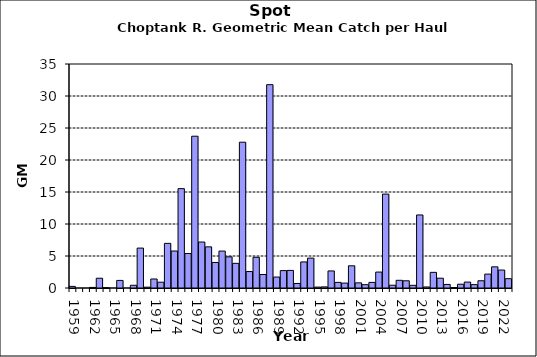
| Category | Series 0 |
|---|---|
| 1959.0 | 0.251 |
| 1960.0 | 0 |
| 1961.0 | 0 |
| 1962.0 | 0.091 |
| 1963.0 | 1.527 |
| 1964.0 | 0.044 |
| 1965.0 | 0 |
| 1966.0 | 1.185 |
| 1967.0 | 0 |
| 1968.0 | 0.426 |
| 1969.0 | 6.237 |
| 1970.0 | 0.128 |
| 1971.0 | 1.407 |
| 1972.0 | 0.905 |
| 1973.0 | 6.974 |
| 1974.0 | 5.78 |
| 1975.0 | 15.524 |
| 1976.0 | 5.389 |
| 1977.0 | 23.717 |
| 1978.0 | 7.182 |
| 1979.0 | 6.429 |
| 1980.0 | 3.987 |
| 1981.0 | 5.77 |
| 1982.0 | 4.871 |
| 1983.0 | 3.851 |
| 1984.0 | 22.779 |
| 1985.0 | 2.572 |
| 1986.0 | 4.8 |
| 1987.0 | 2.109 |
| 1988.0 | 31.77 |
| 1989.0 | 1.71 |
| 1990.0 | 2.719 |
| 1991.0 | 2.747 |
| 1992.0 | 0.71 |
| 1993.0 | 4.073 |
| 1994.0 | 4.67 |
| 1995.0 | 0.142 |
| 1996.0 | 0.175 |
| 1997.0 | 2.664 |
| 1998.0 | 0.876 |
| 1999.0 | 0.762 |
| 2000.0 | 3.472 |
| 2001.0 | 0.804 |
| 2002.0 | 0.52 |
| 2003.0 | 0.874 |
| 2004.0 | 2.49 |
| 2005.0 | 14.674 |
| 2006.0 | 0.435 |
| 2007.0 | 1.202 |
| 2008.0 | 1.126 |
| 2009.0 | 0.417 |
| 2010.0 | 11.412 |
| 2011.0 | 0.161 |
| 2012.0 | 2.446 |
| 2013.0 | 1.531 |
| 2014.0 | 0.557 |
| 2015.0 | 0.078 |
| 2016.0 | 0.593 |
| 2017.0 | 0.923 |
| 2018.0 | 0.527 |
| 2019.0 | 1.132 |
| 2020.0 | 2.17 |
| 2021.0 | 3.306 |
| 2022.0 | 2.803 |
| 2023.0 | 1.456 |